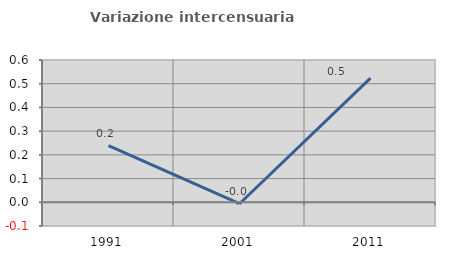
| Category | Variazione intercensuaria annua |
|---|---|
| 1991.0 | 0.238 |
| 2001.0 | -0.006 |
| 2011.0 | 0.524 |